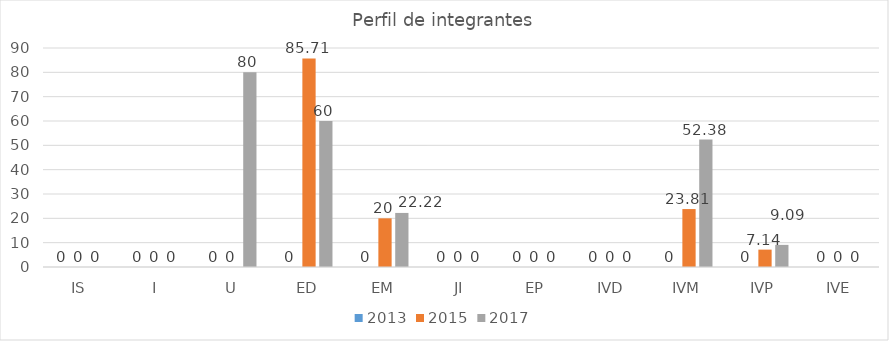
| Category | 2013 | 2015 | 2017 |
|---|---|---|---|
| IS | 0 | 0 | 0 |
| I | 0 | 0 | 0 |
| U | 0 | 0 | 80 |
| ED | 0 | 85.71 | 60 |
| EM | 0 | 20 | 22.22 |
| JI | 0 | 0 | 0 |
| EP | 0 | 0 | 0 |
| IVD | 0 | 0 | 0 |
| IVM | 0 | 23.81 | 52.38 |
| IVP | 0 | 7.14 | 9.09 |
| IVE | 0 | 0 | 0 |